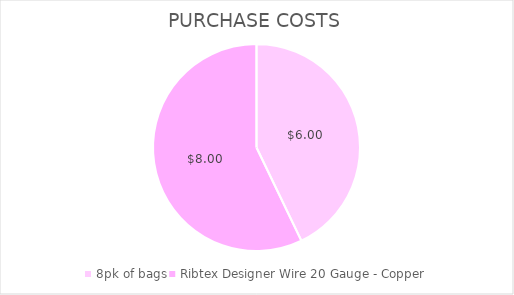
| Category | Series 0 |
|---|---|
| 8pk of bags | 6 |
| Ribtex Designer Wire 20 Gauge - Copper | 8 |